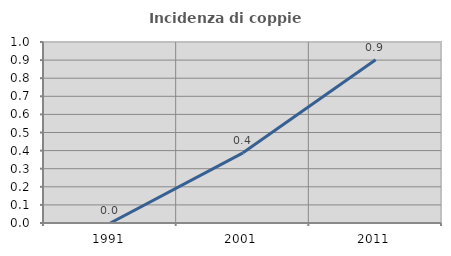
| Category | Incidenza di coppie miste |
|---|---|
| 1991.0 | 0 |
| 2001.0 | 0.388 |
| 2011.0 | 0.902 |